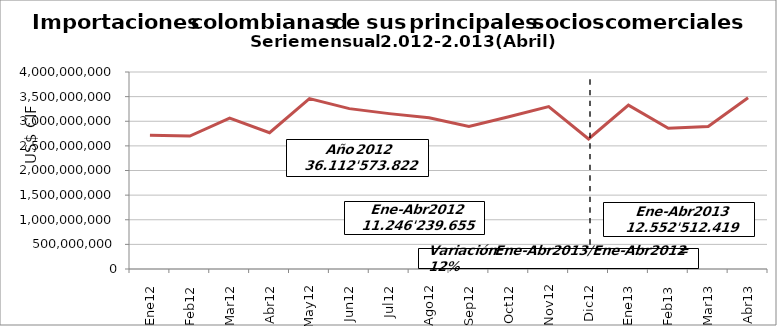
| Category | Series 0 |
|---|---|
| 0 | 2714011437.58 |
| 1 | 2699268784.88 |
| 2 | 3065662397.58 |
| 3 | 2767297034.68 |
| 4 | 3460893375.7 |
| 5 | 3256209848.37 |
| 6 | 3154907330.01 |
| 7 | 3069299246.32 |
| 8 | 2895005069.95 |
| 9 | 3092501380.6 |
| 10 | 3297392411.66 |
| 11 | 2640125505.09 |
| 12 | 3325869844.68 |
| 13 | 2856012104.78 |
| 14 | 2894795810.99 |
| 15 | 3475834658.78 |